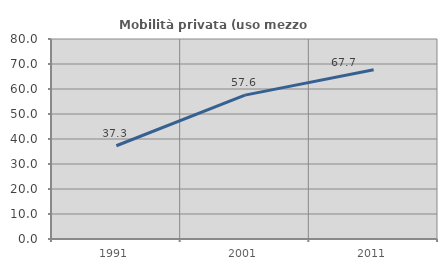
| Category | Mobilità privata (uso mezzo privato) |
|---|---|
| 1991.0 | 37.308 |
| 2001.0 | 57.551 |
| 2011.0 | 67.734 |